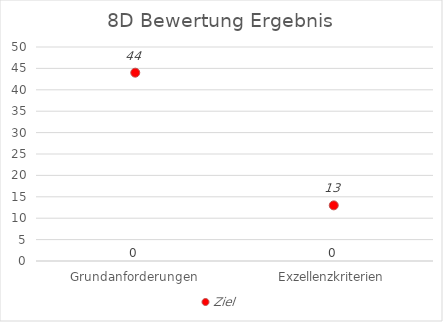
| Category | 8D Evaluation |
|---|---|
| Grundanforderungen | 0 |
| Exzellenzkriterien | 0 |